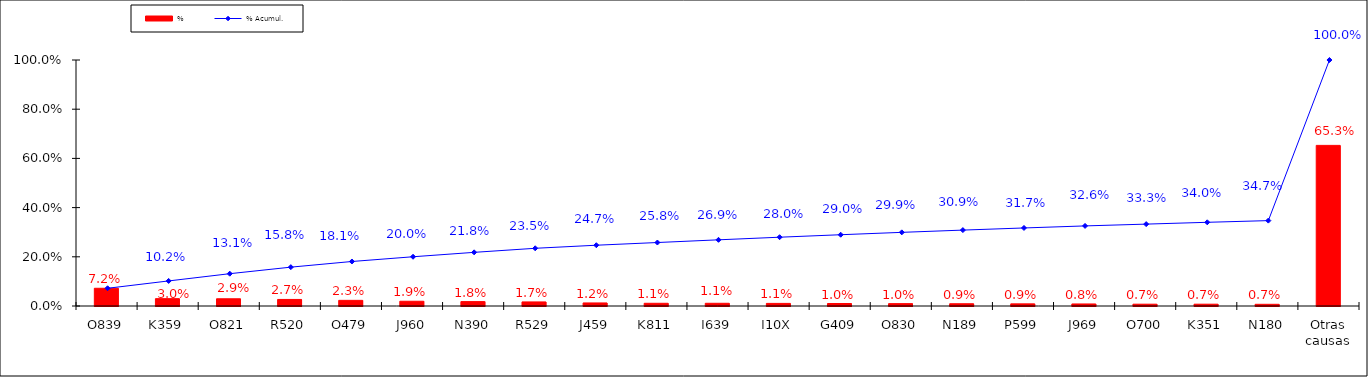
| Category | % |
|---|---|
| O839 | 0.072 |
| K359 | 0.03 |
| O821 | 0.029 |
| R520 | 0.027 |
| O479 | 0.023 |
| J960 | 0.019 |
| N390 | 0.018 |
| R529 | 0.017 |
| J459 | 0.012 |
| K811 | 0.011 |
| I639 | 0.011 |
| I10X | 0.011 |
| G409 | 0.01 |
| O830 | 0.01 |
| N189 | 0.009 |
| P599 | 0.009 |
| J969 | 0.008 |
| O700 | 0.007 |
| K351 | 0.007 |
| N180 | 0.007 |
| Otras causas | 0.653 |